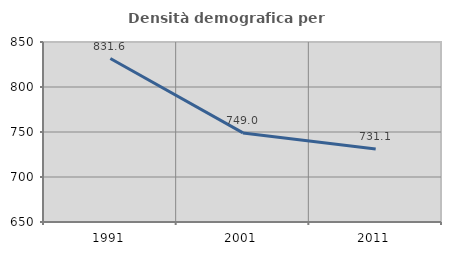
| Category | Densità demografica |
|---|---|
| 1991.0 | 831.646 |
| 2001.0 | 748.975 |
| 2011.0 | 731.093 |